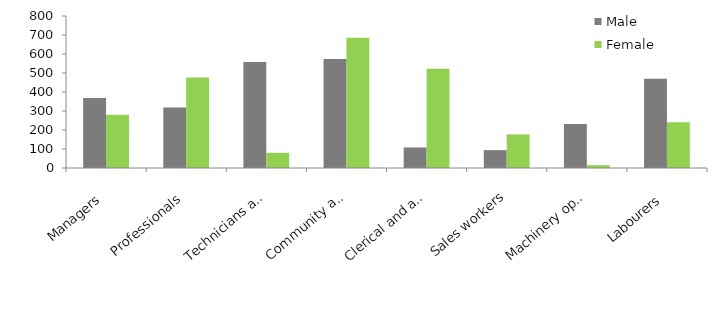
| Category | Male | Female |
|---|---|---|
| Managers | 369 | 280 |
| Professionals | 318 | 476 |
| Technicians and trades workers | 558 | 80 |
| Community and personal service workers | 574 | 685 |
| Clerical and administrative workers | 108 | 523 |
| Sales workers | 94 | 177 |
| Machinery operators and drivers | 232 | 15 |
| Labourers | 470 | 241 |